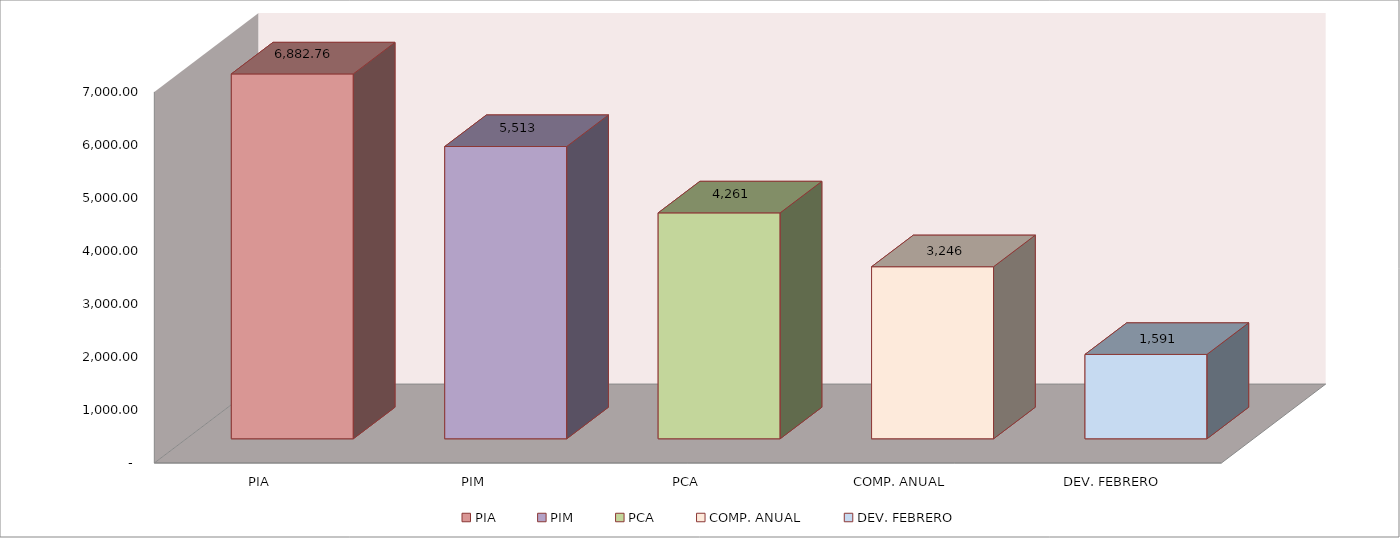
| Category | 011 MINISTERIO DE SALUD |
|---|---|
| PIA | 6882.759 |
| PIM | 5513.21 |
| PCA | 4261.403 |
| COMP. ANUAL | 3245.502 |
| DEV. FEBRERO | 1591.5 |